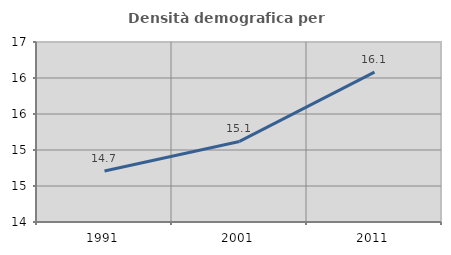
| Category | Densità demografica |
|---|---|
| 1991.0 | 14.709 |
| 2001.0 | 15.119 |
| 2011.0 | 16.082 |